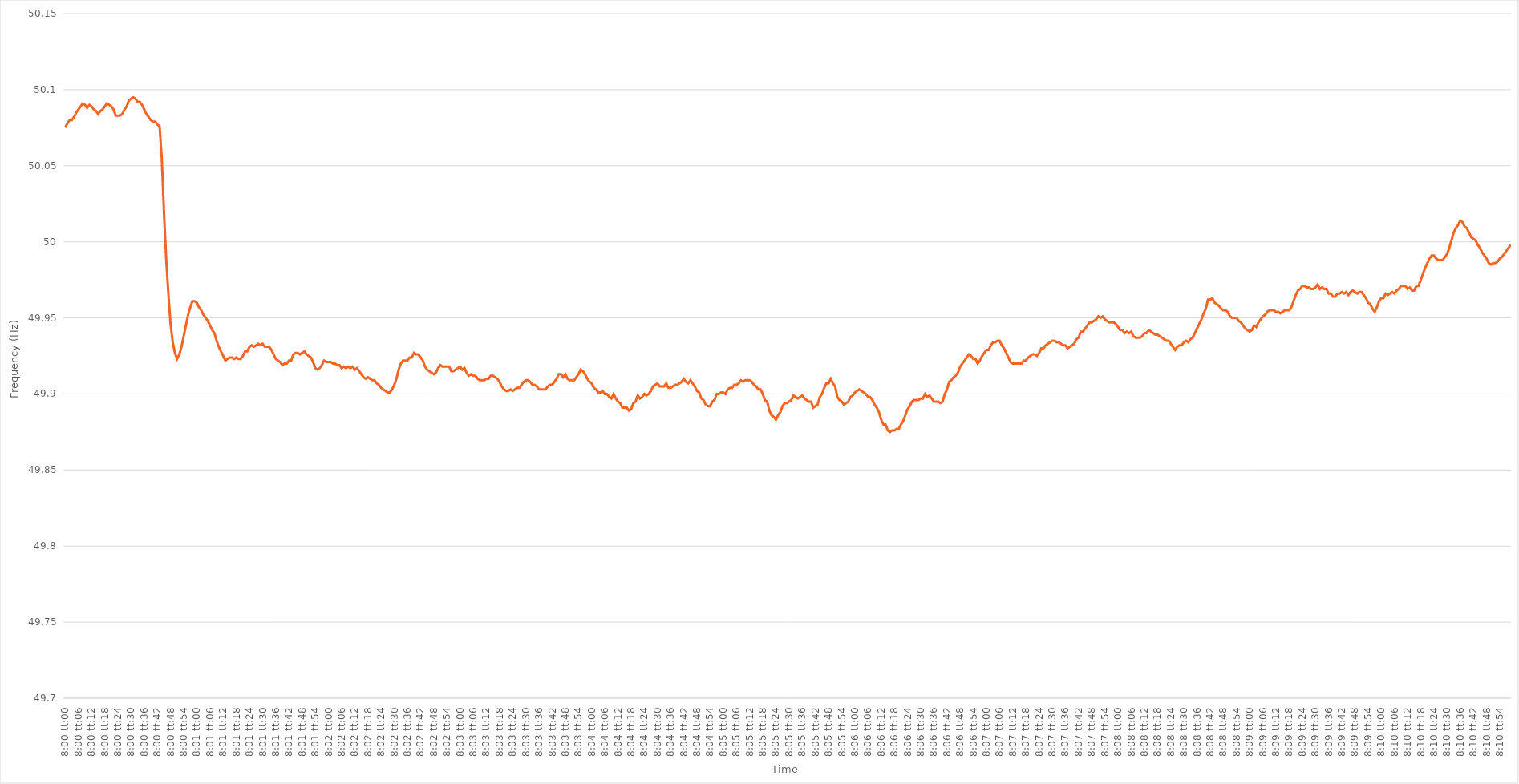
| Category | Series 0 |
|---|---|
| 0.3333333333333333 | 50.075 |
| 0.33334490740740735 | 50.078 |
| 0.3333564814814815 | 50.08 |
| 0.33336805555555554 | 50.08 |
| 0.33337962962962964 | 50.082 |
| 0.3333912037037037 | 50.085 |
| 0.33340277777777777 | 50.087 |
| 0.3334143518518518 | 50.089 |
| 0.33342592592592596 | 50.091 |
| 0.3334375 | 50.09 |
| 0.3334490740740741 | 50.088 |
| 0.33346064814814813 | 50.09 |
| 0.3334722222222222 | 50.089 |
| 0.33348379629629626 | 50.087 |
| 0.3334953703703704 | 50.086 |
| 0.33350694444444445 | 50.084 |
| 0.33351851851851855 | 50.086 |
| 0.3335300925925926 | 50.087 |
| 0.3335416666666667 | 50.089 |
| 0.3335532407407407 | 50.091 |
| 0.33356481481481487 | 50.09 |
| 0.3335763888888889 | 50.089 |
| 0.33358796296296295 | 50.087 |
| 0.33359953703703704 | 50.083 |
| 0.3336111111111111 | 50.083 |
| 0.3336226851851852 | 50.083 |
| 0.3336342592592592 | 50.084 |
| 0.33364583333333336 | 50.087 |
| 0.3336574074074074 | 50.089 |
| 0.3336689814814815 | 50.093 |
| 0.33368055555555554 | 50.094 |
| 0.33369212962962963 | 50.095 |
| 0.33370370370370367 | 50.094 |
| 0.3337152777777778 | 50.092 |
| 0.33372685185185186 | 50.092 |
| 0.33373842592592595 | 50.09 |
| 0.33375 | 50.087 |
| 0.3337615740740741 | 50.084 |
| 0.3337731481481481 | 50.082 |
| 0.3337847222222223 | 50.08 |
| 0.3337962962962963 | 50.079 |
| 0.33380787037037035 | 50.079 |
| 0.33381944444444445 | 50.077 |
| 0.3338310185185185 | 50.076 |
| 0.3338425925925926 | 50.055 |
| 0.3338541666666666 | 50.02 |
| 0.33386574074074077 | 49.989 |
| 0.3338773148148148 | 49.966 |
| 0.3338888888888889 | 49.946 |
| 0.33390046296296294 | 49.934 |
| 0.33391203703703703 | 49.927 |
| 0.3339236111111111 | 49.923 |
| 0.3339351851851852 | 49.926 |
| 0.33394675925925926 | 49.931 |
| 0.33395833333333336 | 49.938 |
| 0.3339699074074074 | 49.945 |
| 0.3339814814814815 | 49.952 |
| 0.33399305555555553 | 49.957 |
| 0.3340046296296297 | 49.961 |
| 0.3340162037037037 | 49.961 |
| 0.3340277777777778 | 49.96 |
| 0.33403935185185185 | 49.957 |
| 0.3340509259259259 | 49.955 |
| 0.3340625 | 49.952 |
| 0.334074074074074 | 49.95 |
| 0.3340856481481482 | 49.948 |
| 0.3340972222222222 | 49.945 |
| 0.3341087962962963 | 49.942 |
| 0.33412037037037035 | 49.94 |
| 0.33413194444444444 | 49.935 |
| 0.3341435185185185 | 49.931 |
| 0.33415509259259263 | 49.928 |
| 0.33416666666666667 | 49.925 |
| 0.33417824074074076 | 49.922 |
| 0.3341898148148148 | 49.923 |
| 0.3342013888888889 | 49.924 |
| 0.33421296296296293 | 49.924 |
| 0.3342245370370371 | 49.923 |
| 0.3342361111111111 | 49.924 |
| 0.3342476851851852 | 49.923 |
| 0.33425925925925926 | 49.923 |
| 0.33427083333333335 | 49.925 |
| 0.3342824074074074 | 49.928 |
| 0.33429398148148143 | 49.928 |
| 0.3343055555555556 | 49.931 |
| 0.3343171296296296 | 49.932 |
| 0.3343287037037037 | 49.931 |
| 0.33434027777777775 | 49.932 |
| 0.33435185185185184 | 49.933 |
| 0.3343634259259259 | 49.932 |
| 0.33437500000000003 | 49.933 |
| 0.33438657407407407 | 49.931 |
| 0.33439814814814817 | 49.931 |
| 0.3344097222222222 | 49.931 |
| 0.3344212962962963 | 49.929 |
| 0.33443287037037034 | 49.926 |
| 0.3344444444444445 | 49.923 |
| 0.3344560185185185 | 49.922 |
| 0.3344675925925926 | 49.921 |
| 0.33447916666666666 | 49.919 |
| 0.33449074074074076 | 49.92 |
| 0.3345023148148148 | 49.92 |
| 0.33451388888888894 | 49.922 |
| 0.334525462962963 | 49.922 |
| 0.334537037037037 | 49.926 |
| 0.3345486111111111 | 49.927 |
| 0.33456018518518515 | 49.927 |
| 0.33457175925925925 | 49.926 |
| 0.3345833333333333 | 49.927 |
| 0.33459490740740744 | 49.928 |
| 0.3346064814814815 | 49.926 |
| 0.33461805555555557 | 49.925 |
| 0.3346296296296296 | 49.924 |
| 0.3346412037037037 | 49.921 |
| 0.33465277777777774 | 49.917 |
| 0.3346643518518519 | 49.916 |
| 0.33467592592592593 | 49.917 |
| 0.3346875 | 49.919 |
| 0.33469907407407407 | 49.922 |
| 0.33471064814814816 | 49.921 |
| 0.3347222222222222 | 49.921 |
| 0.33473379629629635 | 49.921 |
| 0.3347453703703704 | 49.92 |
| 0.3347569444444444 | 49.92 |
| 0.3347685185185185 | 49.919 |
| 0.33478009259259256 | 49.919 |
| 0.33479166666666665 | 49.917 |
| 0.3348032407407407 | 49.918 |
| 0.33481481481481484 | 49.917 |
| 0.3348263888888889 | 49.918 |
| 0.334837962962963 | 49.917 |
| 0.334849537037037 | 49.918 |
| 0.3348611111111111 | 49.916 |
| 0.33487268518518515 | 49.917 |
| 0.3348842592592593 | 49.915 |
| 0.33489583333333334 | 49.913 |
| 0.33490740740740743 | 49.911 |
| 0.33491898148148147 | 49.91 |
| 0.33493055555555556 | 49.911 |
| 0.3349421296296296 | 49.91 |
| 0.33495370370370375 | 49.909 |
| 0.3349652777777778 | 49.909 |
| 0.3349768518518519 | 49.907 |
| 0.3349884259259259 | 49.906 |
| 0.33499999999999996 | 49.904 |
| 0.33501157407407406 | 49.903 |
| 0.3350231481481481 | 49.902 |
| 0.33503472222222225 | 49.901 |
| 0.3350462962962963 | 49.901 |
| 0.3350578703703704 | 49.903 |
| 0.3350694444444444 | 49.906 |
| 0.3350810185185185 | 49.91 |
| 0.33509259259259255 | 49.916 |
| 0.3351041666666667 | 49.92 |
| 0.33511574074074074 | 49.922 |
| 0.33512731481481484 | 49.922 |
| 0.3351388888888889 | 49.922 |
| 0.33515046296296297 | 49.924 |
| 0.335162037037037 | 49.924 |
| 0.33517361111111116 | 49.927 |
| 0.3351851851851852 | 49.926 |
| 0.3351967592592593 | 49.926 |
| 0.33520833333333333 | 49.924 |
| 0.3352199074074074 | 49.922 |
| 0.33523148148148146 | 49.918 |
| 0.3352430555555555 | 49.916 |
| 0.33525462962962965 | 49.915 |
| 0.3352662037037037 | 49.914 |
| 0.3352777777777778 | 49.913 |
| 0.3352893518518518 | 49.914 |
| 0.3353009259259259 | 49.917 |
| 0.33531249999999996 | 49.919 |
| 0.3353240740740741 | 49.918 |
| 0.33533564814814815 | 49.918 |
| 0.33534722222222224 | 49.918 |
| 0.3353587962962963 | 49.918 |
| 0.3353703703703704 | 49.915 |
| 0.3353819444444444 | 49.915 |
| 0.33539351851851856 | 49.916 |
| 0.3354050925925926 | 49.917 |
| 0.3354166666666667 | 49.918 |
| 0.33542824074074074 | 49.916 |
| 0.33543981481481483 | 49.917 |
| 0.33545138888888887 | 49.914 |
| 0.335462962962963 | 49.912 |
| 0.33547453703703706 | 49.913 |
| 0.3354861111111111 | 49.912 |
| 0.3354976851851852 | 49.912 |
| 0.33550925925925923 | 49.91 |
| 0.3355208333333333 | 49.909 |
| 0.33553240740740736 | 49.909 |
| 0.3355439814814815 | 49.909 |
| 0.33555555555555555 | 49.91 |
| 0.33556712962962965 | 49.91 |
| 0.3355787037037037 | 49.912 |
| 0.3355902777777778 | 49.912 |
| 0.3356018518518518 | 49.911 |
| 0.33561342592592597 | 49.91 |
| 0.335625 | 49.908 |
| 0.3356365740740741 | 49.905 |
| 0.33564814814814814 | 49.903 |
| 0.33565972222222223 | 49.902 |
| 0.3356712962962963 | 49.902 |
| 0.3356828703703704 | 49.903 |
| 0.33569444444444446 | 49.902 |
| 0.3357060185185185 | 49.903 |
| 0.3357175925925926 | 49.904 |
| 0.33572916666666663 | 49.904 |
| 0.33574074074074073 | 49.906 |
| 0.33575231481481477 | 49.908 |
| 0.3357638888888889 | 49.909 |
| 0.33577546296296296 | 49.909 |
| 0.33578703703703705 | 49.908 |
| 0.3357986111111111 | 49.906 |
| 0.3358101851851852 | 49.906 |
| 0.3358217592592592 | 49.905 |
| 0.3358333333333334 | 49.903 |
| 0.3358449074074074 | 49.903 |
| 0.3358564814814815 | 49.903 |
| 0.33586805555555554 | 49.903 |
| 0.33587962962962964 | 49.905 |
| 0.3358912037037037 | 49.906 |
| 0.33590277777777783 | 49.906 |
| 0.33591435185185187 | 49.908 |
| 0.33592592592592596 | 49.91 |
| 0.3359375 | 49.913 |
| 0.33594907407407404 | 49.913 |
| 0.33596064814814813 | 49.911 |
| 0.33597222222222217 | 49.913 |
| 0.3359837962962963 | 49.91 |
| 0.33599537037037036 | 49.909 |
| 0.33600694444444446 | 49.909 |
| 0.3360185185185185 | 49.909 |
| 0.3360300925925926 | 49.911 |
| 0.3360416666666666 | 49.913 |
| 0.3360532407407408 | 49.916 |
| 0.3360648148148148 | 49.915 |
| 0.3360763888888889 | 49.913 |
| 0.33608796296296295 | 49.91 |
| 0.33609953703703704 | 49.908 |
| 0.3361111111111111 | 49.907 |
| 0.33612268518518523 | 49.904 |
| 0.33613425925925927 | 49.903 |
| 0.33614583333333337 | 49.901 |
| 0.3361574074074074 | 49.901 |
| 0.3361689814814815 | 49.902 |
| 0.33618055555555554 | 49.9 |
| 0.3361921296296296 | 49.9 |
| 0.3362037037037037 | 49.898 |
| 0.33621527777777777 | 49.897 |
| 0.33622685185185186 | 49.9 |
| 0.3362384259259259 | 49.897 |
| 0.33625 | 49.895 |
| 0.33626157407407403 | 49.894 |
| 0.3362731481481482 | 49.891 |
| 0.3362847222222222 | 49.891 |
| 0.3362962962962963 | 49.891 |
| 0.33630787037037035 | 49.889 |
| 0.33631944444444445 | 49.89 |
| 0.3363310185185185 | 49.894 |
| 0.33634259259259264 | 49.895 |
| 0.3363541666666667 | 49.899 |
| 0.33636574074074077 | 49.897 |
| 0.3363773148148148 | 49.898 |
| 0.3363888888888889 | 49.9 |
| 0.33640046296296294 | 49.899 |
| 0.336412037037037 | 49.9 |
| 0.33642361111111113 | 49.902 |
| 0.33643518518518517 | 49.905 |
| 0.33644675925925926 | 49.906 |
| 0.3364583333333333 | 49.907 |
| 0.3364699074074074 | 49.905 |
| 0.33648148148148144 | 49.905 |
| 0.3364930555555556 | 49.905 |
| 0.3365046296296296 | 49.907 |
| 0.3365162037037037 | 49.904 |
| 0.33652777777777776 | 49.904 |
| 0.33653935185185185 | 49.905 |
| 0.3365509259259259 | 49.906 |
| 0.33656250000000004 | 49.906 |
| 0.3365740740740741 | 49.907 |
| 0.3365856481481482 | 49.908 |
| 0.3365972222222222 | 49.91 |
| 0.3366087962962963 | 49.908 |
| 0.33662037037037035 | 49.907 |
| 0.3366319444444445 | 49.909 |
| 0.33664351851851854 | 49.907 |
| 0.3366550925925926 | 49.905 |
| 0.33666666666666667 | 49.902 |
| 0.3366782407407407 | 49.901 |
| 0.3366898148148148 | 49.897 |
| 0.33670138888888884 | 49.896 |
| 0.336712962962963 | 49.893 |
| 0.33672453703703703 | 49.892 |
| 0.3367361111111111 | 49.892 |
| 0.33674768518518516 | 49.895 |
| 0.33675925925925926 | 49.896 |
| 0.3367708333333333 | 49.9 |
| 0.33678240740740745 | 49.9 |
| 0.3367939814814815 | 49.901 |
| 0.3368055555555556 | 49.901 |
| 0.3368171296296296 | 49.9 |
| 0.3368287037037037 | 49.903 |
| 0.33684027777777775 | 49.904 |
| 0.3368518518518519 | 49.904 |
| 0.33686342592592594 | 49.906 |
| 0.33687500000000004 | 49.906 |
| 0.3368865740740741 | 49.907 |
| 0.3368981481481481 | 49.909 |
| 0.3369097222222222 | 49.908 |
| 0.33692129629629625 | 49.909 |
| 0.3369328703703704 | 49.909 |
| 0.33694444444444444 | 49.909 |
| 0.33695601851851853 | 49.908 |
| 0.33696759259259257 | 49.906 |
| 0.33697916666666666 | 49.905 |
| 0.3369907407407407 | 49.903 |
| 0.33700231481481485 | 49.903 |
| 0.3370138888888889 | 49.9 |
| 0.337025462962963 | 49.896 |
| 0.337037037037037 | 49.895 |
| 0.3370486111111111 | 49.889 |
| 0.33706018518518516 | 49.886 |
| 0.3370717592592593 | 49.885 |
| 0.33708333333333335 | 49.883 |
| 0.33709490740740744 | 49.886 |
| 0.3371064814814815 | 49.888 |
| 0.3371180555555556 | 49.892 |
| 0.3371296296296296 | 49.894 |
| 0.33714120370370365 | 49.894 |
| 0.3371527777777778 | 49.895 |
| 0.33716435185185184 | 49.896 |
| 0.33717592592592593 | 49.899 |
| 0.3371875 | 49.898 |
| 0.33719907407407407 | 49.897 |
| 0.3372106481481481 | 49.898 |
| 0.33722222222222226 | 49.899 |
| 0.3372337962962963 | 49.897 |
| 0.3372453703703704 | 49.896 |
| 0.33725694444444443 | 49.895 |
| 0.3372685185185185 | 49.895 |
| 0.33728009259259256 | 49.891 |
| 0.3372916666666667 | 49.892 |
| 0.33730324074074075 | 49.893 |
| 0.33731481481481485 | 49.898 |
| 0.3373263888888889 | 49.9 |
| 0.337337962962963 | 49.904 |
| 0.337349537037037 | 49.907 |
| 0.33736111111111106 | 49.907 |
| 0.3373726851851852 | 49.91 |
| 0.33738425925925924 | 49.907 |
| 0.33739583333333334 | 49.905 |
| 0.3374074074074074 | 49.898 |
| 0.3374189814814815 | 49.896 |
| 0.3374305555555555 | 49.895 |
| 0.33744212962962966 | 49.893 |
| 0.3374537037037037 | 49.894 |
| 0.3374652777777778 | 49.895 |
| 0.33747685185185183 | 49.898 |
| 0.33748842592592593 | 49.899 |
| 0.33749999999999997 | 49.901 |
| 0.3375115740740741 | 49.902 |
| 0.33752314814814816 | 49.903 |
| 0.33753472222222225 | 49.902 |
| 0.3375462962962963 | 49.901 |
| 0.3375578703703704 | 49.9 |
| 0.3375694444444444 | 49.898 |
| 0.33758101851851857 | 49.898 |
| 0.3375925925925926 | 49.896 |
| 0.33760416666666665 | 49.893 |
| 0.33761574074074074 | 49.891 |
| 0.3376273148148148 | 49.888 |
| 0.3376388888888889 | 49.883 |
| 0.3376504629629629 | 49.88 |
| 0.33766203703703707 | 49.88 |
| 0.3376736111111111 | 49.876 |
| 0.3376851851851852 | 49.875 |
| 0.33769675925925924 | 49.876 |
| 0.33770833333333333 | 49.876 |
| 0.33771990740740737 | 49.877 |
| 0.3377314814814815 | 49.877 |
| 0.33774305555555556 | 49.88 |
| 0.33775462962962965 | 49.882 |
| 0.3377662037037037 | 49.886 |
| 0.3377777777777778 | 49.89 |
| 0.3377893518518518 | 49.892 |
| 0.337800925925926 | 49.895 |
| 0.3378125 | 49.896 |
| 0.3378240740740741 | 49.896 |
| 0.33783564814814815 | 49.896 |
| 0.3378472222222222 | 49.897 |
| 0.3378587962962963 | 49.897 |
| 0.3378703703703703 | 49.9 |
| 0.33788194444444447 | 49.898 |
| 0.3378935185185185 | 49.899 |
| 0.3379050925925926 | 49.897 |
| 0.33791666666666664 | 49.895 |
| 0.33792824074074074 | 49.895 |
| 0.3379398148148148 | 49.895 |
| 0.3379513888888889 | 49.894 |
| 0.33796296296296297 | 49.895 |
| 0.33797453703703706 | 49.9 |
| 0.3379861111111111 | 49.903 |
| 0.3379976851851852 | 49.908 |
| 0.33800925925925923 | 49.909 |
| 0.3380208333333334 | 49.911 |
| 0.3380324074074074 | 49.912 |
| 0.3380439814814815 | 49.914 |
| 0.33805555555555555 | 49.918 |
| 0.33806712962962965 | 49.92 |
| 0.3380787037037037 | 49.922 |
| 0.3380902777777777 | 49.924 |
| 0.3381018518518519 | 49.926 |
| 0.3381134259259259 | 49.925 |
| 0.338125 | 49.923 |
| 0.33813657407407405 | 49.923 |
| 0.33814814814814814 | 49.92 |
| 0.3381597222222222 | 49.922 |
| 0.33817129629629633 | 49.925 |
| 0.33818287037037037 | 49.927 |
| 0.33819444444444446 | 49.929 |
| 0.3382060185185185 | 49.929 |
| 0.3382175925925926 | 49.932 |
| 0.33822916666666664 | 49.934 |
| 0.3382407407407408 | 49.934 |
| 0.3382523148148148 | 49.935 |
| 0.3382638888888889 | 49.935 |
| 0.33827546296296296 | 49.932 |
| 0.33828703703703705 | 49.93 |
| 0.3382986111111111 | 49.927 |
| 0.33831018518518513 | 49.924 |
| 0.3383217592592593 | 49.921 |
| 0.3383333333333333 | 49.92 |
| 0.3383449074074074 | 49.92 |
| 0.33835648148148145 | 49.92 |
| 0.33836805555555555 | 49.92 |
| 0.3383796296296296 | 49.92 |
| 0.33839120370370374 | 49.922 |
| 0.3384027777777778 | 49.922 |
| 0.33841435185185187 | 49.924 |
| 0.3384259259259259 | 49.925 |
| 0.3384375 | 49.926 |
| 0.33844907407407404 | 49.926 |
| 0.3384606481481482 | 49.925 |
| 0.33847222222222223 | 49.927 |
| 0.3384837962962963 | 49.93 |
| 0.33849537037037036 | 49.93 |
| 0.33850694444444446 | 49.932 |
| 0.3385185185185185 | 49.933 |
| 0.33853009259259265 | 49.934 |
| 0.3385416666666667 | 49.935 |
| 0.3385532407407407 | 49.935 |
| 0.3385648148148148 | 49.934 |
| 0.33857638888888886 | 49.934 |
| 0.33858796296296295 | 49.933 |
| 0.338599537037037 | 49.932 |
| 0.33861111111111114 | 49.932 |
| 0.3386226851851852 | 49.93 |
| 0.3386342592592593 | 49.931 |
| 0.3386458333333333 | 49.932 |
| 0.3386574074074074 | 49.933 |
| 0.33866898148148145 | 49.936 |
| 0.3386805555555556 | 49.937 |
| 0.33869212962962963 | 49.941 |
| 0.33870370370370373 | 49.941 |
| 0.33871527777777777 | 49.943 |
| 0.33872685185185186 | 49.945 |
| 0.3387384259259259 | 49.947 |
| 0.33875000000000005 | 49.947 |
| 0.3387615740740741 | 49.948 |
| 0.3387731481481482 | 49.949 |
| 0.3387847222222222 | 49.951 |
| 0.33879629629629626 | 49.95 |
| 0.33880787037037036 | 49.951 |
| 0.3388194444444444 | 49.949 |
| 0.33883101851851855 | 49.948 |
| 0.3388425925925926 | 49.947 |
| 0.3388541666666667 | 49.947 |
| 0.3388657407407407 | 49.947 |
| 0.3388773148148148 | 49.946 |
| 0.33888888888888885 | 49.944 |
| 0.338900462962963 | 49.942 |
| 0.33891203703703704 | 49.942 |
| 0.33892361111111113 | 49.94 |
| 0.3389351851851852 | 49.941 |
| 0.33894675925925927 | 49.94 |
| 0.3389583333333333 | 49.941 |
| 0.33896990740740746 | 49.938 |
| 0.3389814814814815 | 49.937 |
| 0.3389930555555556 | 49.937 |
| 0.33900462962962963 | 49.937 |
| 0.33901620370370367 | 49.938 |
| 0.33902777777777776 | 49.94 |
| 0.3390393518518518 | 49.94 |
| 0.33905092592592595 | 49.942 |
| 0.3390625 | 49.941 |
| 0.3390740740740741 | 49.94 |
| 0.3390856481481481 | 49.939 |
| 0.3390972222222222 | 49.939 |
| 0.33910879629629626 | 49.938 |
| 0.3391203703703704 | 49.937 |
| 0.33913194444444444 | 49.936 |
| 0.33914351851851854 | 49.935 |
| 0.3391550925925926 | 49.935 |
| 0.33916666666666667 | 49.933 |
| 0.3391782407407407 | 49.931 |
| 0.33918981481481486 | 49.929 |
| 0.3392013888888889 | 49.931 |
| 0.339212962962963 | 49.932 |
| 0.33922453703703703 | 49.932 |
| 0.3392361111111111 | 49.934 |
| 0.33924768518518517 | 49.935 |
| 0.3392592592592592 | 49.934 |
| 0.33927083333333335 | 49.936 |
| 0.3392824074074074 | 49.937 |
| 0.3392939814814815 | 49.94 |
| 0.3393055555555555 | 49.943 |
| 0.3393171296296296 | 49.946 |
| 0.33932870370370366 | 49.949 |
| 0.3393402777777778 | 49.953 |
| 0.33935185185185185 | 49.956 |
| 0.33936342592592594 | 49.962 |
| 0.339375 | 49.962 |
| 0.3393865740740741 | 49.963 |
| 0.3393981481481481 | 49.96 |
| 0.33940972222222227 | 49.959 |
| 0.3394212962962963 | 49.958 |
| 0.3394328703703704 | 49.956 |
| 0.33944444444444444 | 49.955 |
| 0.33945601851851853 | 49.955 |
| 0.33946759259259257 | 49.954 |
| 0.3394791666666667 | 49.951 |
| 0.33949074074074076 | 49.95 |
| 0.3395023148148148 | 49.95 |
| 0.3395138888888889 | 49.95 |
| 0.33952546296296293 | 49.948 |
| 0.339537037037037 | 49.947 |
| 0.33954861111111106 | 49.945 |
| 0.3395601851851852 | 49.943 |
| 0.33957175925925925 | 49.942 |
| 0.33958333333333335 | 49.941 |
| 0.3395949074074074 | 49.942 |
| 0.3396064814814815 | 49.945 |
| 0.3396180555555555 | 49.944 |
| 0.33962962962962967 | 49.947 |
| 0.3396412037037037 | 49.949 |
| 0.3396527777777778 | 49.951 |
| 0.33966435185185184 | 49.952 |
| 0.33967592592592594 | 49.954 |
| 0.3396875 | 49.955 |
| 0.3396990740740741 | 49.955 |
| 0.33971064814814816 | 49.955 |
| 0.3397222222222222 | 49.954 |
| 0.3397337962962963 | 49.954 |
| 0.33974537037037034 | 49.953 |
| 0.33975694444444443 | 49.954 |
| 0.33976851851851847 | 49.955 |
| 0.3397800925925926 | 49.955 |
| 0.33979166666666666 | 49.955 |
| 0.33980324074074075 | 49.957 |
| 0.3398148148148148 | 49.961 |
| 0.3398263888888889 | 49.965 |
| 0.3398379629629629 | 49.968 |
| 0.3398495370370371 | 49.969 |
| 0.3398611111111111 | 49.971 |
| 0.3398726851851852 | 49.971 |
| 0.33988425925925925 | 49.97 |
| 0.33989583333333334 | 49.97 |
| 0.3399074074074074 | 49.969 |
| 0.33991898148148153 | 49.969 |
| 0.33993055555555557 | 49.97 |
| 0.33994212962962966 | 49.972 |
| 0.3399537037037037 | 49.969 |
| 0.3399652777777778 | 49.97 |
| 0.33997685185185184 | 49.969 |
| 0.3399884259259259 | 49.969 |
| 0.34 | 49.966 |
| 0.34001157407407406 | 49.966 |
| 0.34002314814814816 | 49.964 |
| 0.3400347222222222 | 49.964 |
| 0.3400462962962963 | 49.966 |
| 0.34005787037037033 | 49.966 |
| 0.3400694444444445 | 49.967 |
| 0.3400810185185185 | 49.966 |
| 0.3400925925925926 | 49.967 |
| 0.34010416666666665 | 49.965 |
| 0.34011574074074075 | 49.967 |
| 0.3401273148148148 | 49.968 |
| 0.34013888888888894 | 49.967 |
| 0.340150462962963 | 49.966 |
| 0.34016203703703707 | 49.967 |
| 0.3401736111111111 | 49.967 |
| 0.3401851851851852 | 49.965 |
| 0.34019675925925924 | 49.963 |
| 0.3402083333333333 | 49.96 |
| 0.34021990740740743 | 49.959 |
| 0.34023148148148147 | 49.956 |
| 0.34024305555555556 | 49.954 |
| 0.3402546296296296 | 49.957 |
| 0.3402662037037037 | 49.961 |
| 0.34027777777777773 | 49.963 |
| 0.3402893518518519 | 49.963 |
| 0.3403009259259259 | 49.966 |
| 0.3403125 | 49.965 |
| 0.34032407407407406 | 49.966 |
| 0.34033564814814815 | 49.967 |
| 0.3403472222222222 | 49.966 |
| 0.34035879629629634 | 49.968 |
| 0.3403703703703704 | 49.969 |
| 0.3403819444444445 | 49.971 |
| 0.3403935185185185 | 49.971 |
| 0.3404050925925926 | 49.971 |
| 0.34041666666666665 | 49.969 |
| 0.3404282407407408 | 49.97 |
| 0.34043981481481483 | 49.968 |
| 0.3404513888888889 | 49.968 |
| 0.34046296296296297 | 49.971 |
| 0.340474537037037 | 49.971 |
| 0.3404861111111111 | 49.975 |
| 0.34049768518518514 | 49.979 |
| 0.3405092592592593 | 49.983 |
| 0.34052083333333333 | 49.986 |
| 0.3405324074074074 | 49.989 |
| 0.34054398148148146 | 49.991 |
| 0.34055555555555556 | 49.991 |
| 0.3405671296296296 | 49.989 |
| 0.34057870370370374 | 49.988 |
| 0.3405902777777778 | 49.988 |
| 0.3406018518518519 | 49.988 |
| 0.3406134259259259 | 49.99 |
| 0.340625 | 49.992 |
| 0.34063657407407405 | 49.996 |
| 0.3406481481481482 | 50.001 |
| 0.34065972222222224 | 50.006 |
| 0.34067129629629633 | 50.009 |
| 0.34068287037037037 | 50.011 |
| 0.3406944444444444 | 50.014 |
| 0.3407060185185185 | 50.013 |
| 0.34071759259259254 | 50.01 |
| 0.3407291666666667 | 50.009 |
| 0.34074074074074073 | 50.006 |
| 0.3407523148148148 | 50.003 |
| 0.34076388888888887 | 50.002 |
| 0.34077546296296296 | 50.001 |
| 0.340787037037037 | 49.998 |
| 0.34079861111111115 | 49.996 |
| 0.3408101851851852 | 49.993 |
| 0.3408217592592593 | 49.991 |
| 0.3408333333333333 | 49.989 |
| 0.3408449074074074 | 49.986 |
| 0.34085648148148145 | 49.985 |
| 0.3408680555555556 | 49.986 |
| 0.34087962962962964 | 49.986 |
| 0.34089120370370374 | 49.987 |
| 0.3409027777777778 | 49.989 |
| 0.3409143518518518 | 49.99 |
| 0.3409259259259259 | 49.992 |
| 0.34093749999999995 | 49.994 |
| 0.3409490740740741 | 49.996 |
| 0.34096064814814814 | 49.998 |